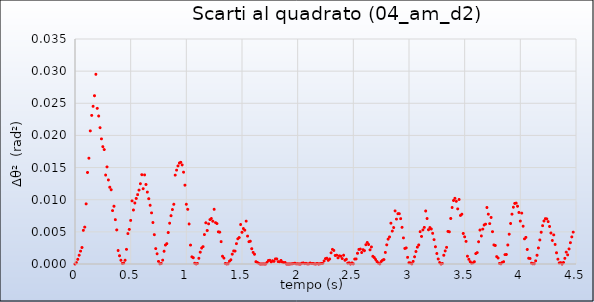
| Category | Series 0 |
|---|---|
| 0.0 | 0 |
| 0.012499999999999956 | 0 |
| 0.02499999999999991 | 0.001 |
| 0.03749999999999987 | 0.001 |
| 0.04999999999999982 | 0.002 |
| 0.0625 | 0.003 |
| 0.07499999999999996 | 0.005 |
| 0.08749999999999991 | 0.006 |
| 0.09999999999999987 | 0.009 |
| 0.11249999999999982 | 0.014 |
| 0.125 | 0.016 |
| 0.13749999999999996 | 0.021 |
| 0.1499999999999999 | 0.023 |
| 0.16249999999999987 | 0.025 |
| 0.17499999999999982 | 0.026 |
| 0.1875 | 0.03 |
| 0.19999999999999996 | 0.024 |
| 0.2124999999999999 | 0.023 |
| 0.22499999999999987 | 0.021 |
| 0.23749999999999982 | 0.019 |
| 0.25 | 0.018 |
| 0.26249999999999996 | 0.018 |
| 0.2749999999999999 | 0.014 |
| 0.2875000000000001 | 0.015 |
| 0.2999999999999998 | 0.013 |
| 0.3125 | 0.012 |
| 0.32499999999999973 | 0.012 |
| 0.3374999999999999 | 0.008 |
| 0.3500000000000001 | 0.009 |
| 0.3624999999999998 | 0.007 |
| 0.375 | 0.005 |
| 0.38749999999999973 | 0.002 |
| 0.3999999999999999 | 0.001 |
| 0.4125000000000001 | 0.001 |
| 0.4249999999999998 | 0 |
| 0.4375 | 0 |
| 0.44999999999999973 | 0.001 |
| 0.4624999999999999 | 0.002 |
| 0.4750000000000001 | 0.005 |
| 0.4874999999999998 | 0.005 |
| 0.5 | 0.007 |
| 0.5124999999999997 | 0.01 |
| 0.5249999999999999 | 0.008 |
| 0.5375000000000001 | 0.009 |
| 0.5499999999999998 | 0.01 |
| 0.5625 | 0.011 |
| 0.5749999999999997 | 0.011 |
| 0.5874999999999999 | 0.012 |
| 0.6000000000000001 | 0.014 |
| 0.6124999999999998 | 0.012 |
| 0.625 | 0.014 |
| 0.6374999999999997 | 0.012 |
| 0.6499999999999999 | 0.011 |
| 0.6625000000000001 | 0.01 |
| 0.6749999999999998 | 0.009 |
| 0.6875 | 0.008 |
| 0.6999999999999997 | 0.006 |
| 0.7124999999999999 | 0.005 |
| 0.7250000000000001 | 0.002 |
| 0.7374999999999998 | 0.002 |
| 0.75 | 0 |
| 0.7624999999999997 | 0 |
| 0.7749999999999999 | 0 |
| 0.7875000000000001 | 0.001 |
| 0.7999999999999998 | 0.002 |
| 0.8125 | 0.003 |
| 0.8249999999999997 | 0.003 |
| 0.8374999999999999 | 0.005 |
| 0.8500000000000001 | 0.006 |
| 0.8624999999999998 | 0.008 |
| 0.875 | 0.008 |
| 0.8874999999999997 | 0.009 |
| 0.8999999999999999 | 0.014 |
| 0.9125000000000001 | 0.015 |
| 0.9249999999999998 | 0.015 |
| 0.9375 | 0.016 |
| 0.9499999999999997 | 0.016 |
| 0.9624999999999999 | 0.015 |
| 0.9750000000000001 | 0.014 |
| 0.9874999999999998 | 0.012 |
| 1.0 | 0.009 |
| 1.0124999999999997 | 0.009 |
| 1.025 | 0.006 |
| 1.0375 | 0.003 |
| 1.0499999999999998 | 0.001 |
| 1.0625 | 0.001 |
| 1.0749999999999997 | 0 |
| 1.0875 | 0 |
| 1.1 | 0 |
| 1.1124999999999998 | 0.001 |
| 1.125 | 0.002 |
| 1.1374999999999997 | 0.002 |
| 1.15 | 0.003 |
| 1.1625 | 0.005 |
| 1.1749999999999998 | 0.006 |
| 1.1875 | 0.005 |
| 1.1999999999999997 | 0.006 |
| 1.2125 | 0.007 |
| 1.225 | 0.007 |
| 1.2374999999999998 | 0.007 |
| 1.25 | 0.009 |
| 1.2624999999999997 | 0.006 |
| 1.275 | 0.006 |
| 1.2875 | 0.005 |
| 1.2999999999999998 | 0.005 |
| 1.3125 | 0.003 |
| 1.3249999999999997 | 0.001 |
| 1.3375 | 0.001 |
| 1.35 | 0 |
| 1.3624999999999998 | 0 |
| 1.375 | 0 |
| 1.3874999999999997 | 0 |
| 1.4 | 0.001 |
| 1.4125 | 0.002 |
| 1.4249999999999998 | 0.002 |
| 1.4375 | 0.002 |
| 1.4499999999999997 | 0.003 |
| 1.4625 | 0.004 |
| 1.475 | 0.004 |
| 1.4874999999999998 | 0.006 |
| 1.5 | 0.005 |
| 1.5124999999999997 | 0.006 |
| 1.525 | 0.005 |
| 1.5375 | 0.007 |
| 1.5499999999999998 | 0.004 |
| 1.5625 | 0.003 |
| 1.5749999999999997 | 0.004 |
| 1.5875 | 0.002 |
| 1.6 | 0.002 |
| 1.6124999999999998 | 0.002 |
| 1.625 | 0 |
| 1.6374999999999997 | 0 |
| 1.65 | 0 |
| 1.6625 | 0 |
| 1.6749999999999998 | 0 |
| 1.6875 | 0 |
| 1.6999999999999997 | 0 |
| 1.7125 | 0 |
| 1.725 | 0 |
| 1.7374999999999998 | 0.001 |
| 1.75 | 0.001 |
| 1.7624999999999997 | 0 |
| 1.775 | 0.001 |
| 1.7875 | 0 |
| 1.7999999999999998 | 0.001 |
| 1.8125 | 0.001 |
| 1.8249999999999997 | 0 |
| 1.8375 | 0 |
| 1.85 | 0.001 |
| 1.8624999999999998 | 0 |
| 1.875 | 0 |
| 1.8874999999999997 | 0 |
| 1.9 | 0 |
| 1.9125 | 0 |
| 1.9249999999999998 | 0 |
| 1.9375 | 0 |
| 1.9499999999999997 | 0 |
| 1.9625 | 0 |
| 1.975 | 0 |
| 1.9874999999999998 | 0 |
| 2.0 | 0 |
| 2.0124999999999997 | 0 |
| 2.025 | 0 |
| 2.0375 | 0 |
| 2.05 | 0 |
| 2.0625 | 0 |
| 2.0749999999999997 | 0 |
| 2.0875 | 0 |
| 2.1 | 0 |
| 2.1125 | 0 |
| 2.125 | 0 |
| 2.1374999999999997 | 0 |
| 2.15 | 0 |
| 2.1625 | 0 |
| 2.175 | 0 |
| 2.1875 | 0 |
| 2.1999999999999997 | 0 |
| 2.2125 | 0 |
| 2.225 | 0 |
| 2.2375 | 0 |
| 2.25 | 0.001 |
| 2.2624999999999997 | 0.001 |
| 2.275 | 0.001 |
| 2.2875 | 0.001 |
| 2.3000000000000003 | 0.002 |
| 2.3124999999999996 | 0.002 |
| 2.3249999999999997 | 0.002 |
| 2.3375 | 0.001 |
| 2.35 | 0.001 |
| 2.3625000000000003 | 0.001 |
| 2.3749999999999996 | 0.001 |
| 2.3874999999999997 | 0.001 |
| 2.4 | 0.001 |
| 2.4125 | 0.001 |
| 2.4250000000000003 | 0.001 |
| 2.4374999999999996 | 0.001 |
| 2.4499999999999997 | 0 |
| 2.4625 | 0 |
| 2.475 | 0 |
| 2.4875000000000003 | 0 |
| 2.4999999999999996 | 0 |
| 2.5124999999999997 | 0.001 |
| 2.525 | 0.001 |
| 2.5375 | 0.002 |
| 2.5500000000000003 | 0.002 |
| 2.5624999999999996 | 0.002 |
| 2.5749999999999997 | 0.002 |
| 2.5875 | 0.002 |
| 2.6 | 0.002 |
| 2.6125000000000003 | 0.003 |
| 2.6249999999999996 | 0.003 |
| 2.6374999999999997 | 0.003 |
| 2.65 | 0.002 |
| 2.6625 | 0.003 |
| 2.6750000000000003 | 0.001 |
| 2.6874999999999996 | 0.001 |
| 2.6999999999999997 | 0.001 |
| 2.7125 | 0 |
| 2.725 | 0 |
| 2.7375000000000003 | 0 |
| 2.7499999999999996 | 0 |
| 2.7624999999999997 | 0.001 |
| 2.775 | 0.001 |
| 2.7875 | 0.002 |
| 2.8000000000000003 | 0.003 |
| 2.8124999999999996 | 0.004 |
| 2.8249999999999997 | 0.004 |
| 2.8375 | 0.006 |
| 2.85 | 0.005 |
| 2.8625000000000003 | 0.006 |
| 2.8749999999999996 | 0.008 |
| 2.8874999999999997 | 0.007 |
| 2.9 | 0.008 |
| 2.9125 | 0.008 |
| 2.9250000000000003 | 0.007 |
| 2.9374999999999996 | 0.006 |
| 2.9499999999999997 | 0.004 |
| 2.9625 | 0.002 |
| 2.975 | 0.003 |
| 2.9875000000000003 | 0.001 |
| 2.9999999999999996 | 0 |
| 3.0124999999999997 | 0 |
| 3.025 | 0 |
| 3.0375 | 0 |
| 3.0500000000000003 | 0.001 |
| 3.0624999999999996 | 0.002 |
| 3.0749999999999997 | 0.003 |
| 3.0875 | 0.003 |
| 3.1 | 0.005 |
| 3.1125000000000003 | 0.004 |
| 3.1249999999999996 | 0.005 |
| 3.1374999999999997 | 0.006 |
| 3.15 | 0.008 |
| 3.1625 | 0.007 |
| 3.1750000000000003 | 0.005 |
| 3.1874999999999996 | 0.006 |
| 3.1999999999999997 | 0.005 |
| 3.2125 | 0.005 |
| 3.225 | 0.004 |
| 3.2375000000000003 | 0.003 |
| 3.2499999999999996 | 0.002 |
| 3.2624999999999997 | 0.001 |
| 3.275 | 0 |
| 3.2875 | 0 |
| 3.3000000000000003 | 0 |
| 3.3124999999999996 | 0.001 |
| 3.3249999999999997 | 0.002 |
| 3.3375 | 0.003 |
| 3.35 | 0.005 |
| 3.3625000000000003 | 0.005 |
| 3.3749999999999996 | 0.007 |
| 3.3874999999999997 | 0.009 |
| 3.4 | 0.01 |
| 3.4125 | 0.01 |
| 3.4250000000000003 | 0.01 |
| 3.4374999999999996 | 0.009 |
| 3.4499999999999997 | 0.01 |
| 3.4625 | 0.008 |
| 3.475 | 0.008 |
| 3.4875000000000003 | 0.005 |
| 3.4999999999999996 | 0.004 |
| 3.5124999999999997 | 0.004 |
| 3.525 | 0.001 |
| 3.5375 | 0.001 |
| 3.5500000000000003 | 0 |
| 3.5624999999999996 | 0 |
| 3.5749999999999997 | 0 |
| 3.5875 | 0 |
| 3.6 | 0.002 |
| 3.6125000000000003 | 0.002 |
| 3.6249999999999996 | 0.003 |
| 3.6374999999999997 | 0.005 |
| 3.65 | 0.004 |
| 3.6625 | 0.005 |
| 3.6750000000000003 | 0.006 |
| 3.6874999999999996 | 0.006 |
| 3.6999999999999997 | 0.009 |
| 3.7125 | 0.008 |
| 3.725 | 0.006 |
| 3.7375000000000003 | 0.007 |
| 3.7499999999999996 | 0.005 |
| 3.7624999999999997 | 0.003 |
| 3.775 | 0.003 |
| 3.7875 | 0.001 |
| 3.8000000000000003 | 0.001 |
| 3.8124999999999996 | 0 |
| 3.8249999999999997 | 0 |
| 3.8375 | 0 |
| 3.85 | 0 |
| 3.8625000000000003 | 0.001 |
| 3.8749999999999996 | 0.001 |
| 3.8874999999999997 | 0.003 |
| 3.9 | 0.005 |
| 3.9125 | 0.006 |
| 3.9250000000000003 | 0.008 |
| 3.9374999999999996 | 0.009 |
| 3.9499999999999997 | 0.009 |
| 3.9625 | 0.009 |
| 3.975 | 0.009 |
| 3.9875000000000003 | 0.008 |
| 3.9999999999999996 | 0.007 |
| 4.012499999999999 | 0.008 |
| 4.025 | 0.006 |
| 4.0375 | 0.004 |
| 4.050000000000001 | 0.004 |
| 4.0625 | 0.002 |
| 4.074999999999999 | 0.001 |
| 4.0875 | 0.001 |
| 4.1 | 0 |
| 4.112500000000001 | 0 |
| 4.125 | 0 |
| 4.137499999999999 | 0 |
| 4.15 | 0.001 |
| 4.1625 | 0.002 |
| 4.175000000000001 | 0.004 |
| 4.1875 | 0.005 |
| 4.199999999999999 | 0.006 |
| 4.2125 | 0.007 |
| 4.225 | 0.007 |
| 4.237500000000001 | 0.007 |
| 4.25 | 0.007 |
| 4.262499999999999 | 0.006 |
| 4.275 | 0.005 |
| 4.2875 | 0.004 |
| 4.300000000000001 | 0.005 |
| 4.3125 | 0.003 |
| 4.324999999999999 | 0.002 |
| 4.3375 | 0.001 |
| 4.35 | 0 |
| 4.362500000000001 | 0 |
| 4.375 | 0 |
| 4.387499999999999 | 0 |
| 4.4 | 0.001 |
| 4.4125 | 0.002 |
| 4.425000000000001 | 0.001 |
| 4.4375 | 0.002 |
| 4.449999999999999 | 0.003 |
| 4.4625 | 0.004 |
| 4.475 | 0.005 |